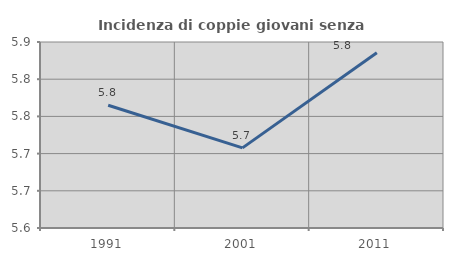
| Category | Incidenza di coppie giovani senza figli |
|---|---|
| 1991.0 | 5.765 |
| 2001.0 | 5.708 |
| 2011.0 | 5.835 |